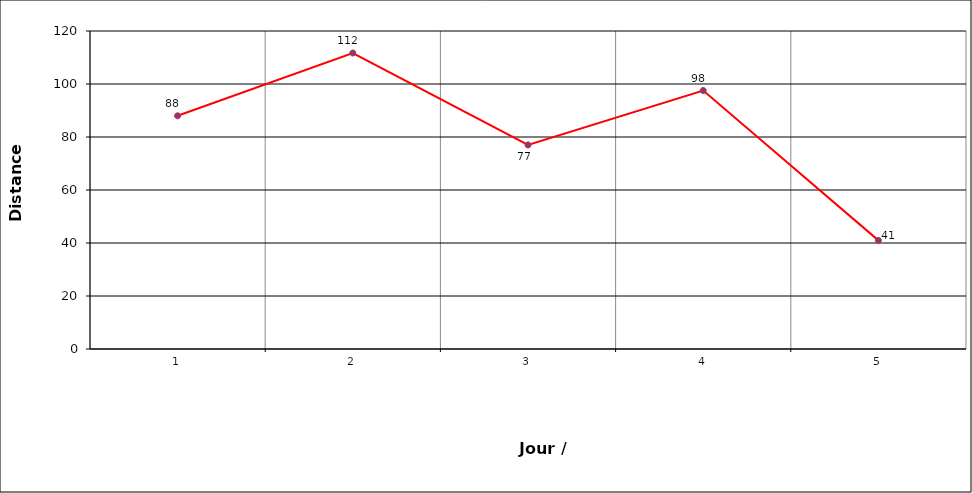
| Category | Series 1 |
|---|---|
| 0 | 88 |
| 1 | 111.7 |
| 2 | 77 |
| 3 | 97.53 |
| 4 | 40.99 |